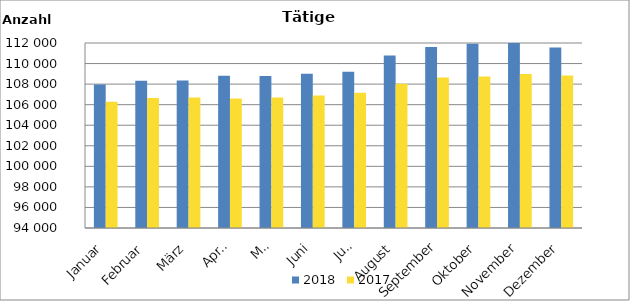
| Category | 2018 | 2017 |
|---|---|---|
| Januar | 107962 | 106290 |
| Februar | 108339 | 106643 |
| März | 108350 | 106709 |
| April | 108819 | 106601 |
| Mai | 108795 | 106704 |
| Juni | 108998 | 106898 |
| Juli | 109201 | 107150 |
| August | 110784 | 108023 |
| September | 111618 | 108635 |
| Oktober | 111921 | 108734 |
| November | 112082 | 108993 |
| Dezember | 111569 | 108832 |